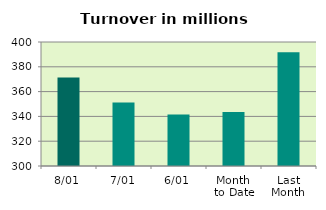
| Category | Series 0 |
|---|---|
| 8/01 | 371.439 |
| 7/01 | 351.306 |
| 6/01 | 341.522 |
| Month 
to Date | 343.554 |
| Last
Month | 391.769 |